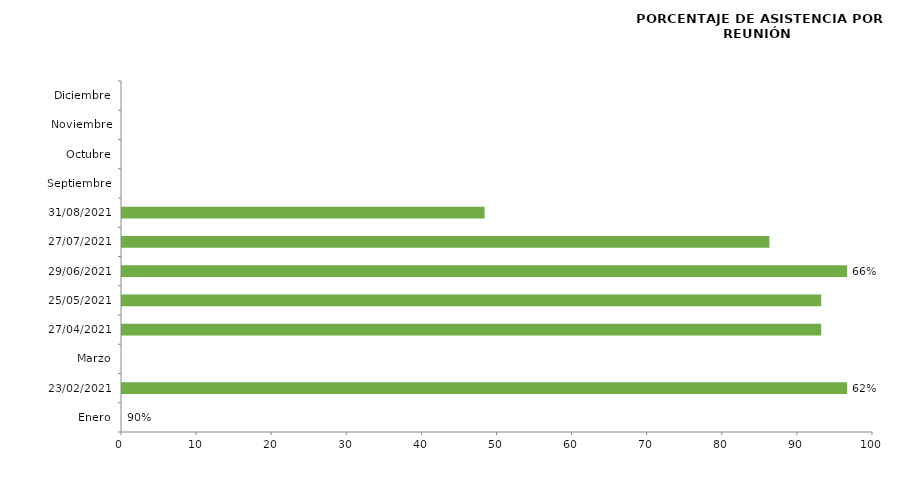
| Category | Series 0 |
|---|---|
| Enero | 0 |
| 23/02/2021 | 96.552 |
| Marzo | 0 |
| 27/04/2021 | 93.103 |
| 25/05/2021 | 93.103 |
| 29/06/2021 | 96.552 |
| 27/07/2021 | 86.207 |
| 31/08/2021 | 48.276 |
| Septiembre | 0 |
| Octubre | 0 |
| Noviembre | 0 |
| Diciembre | 0 |